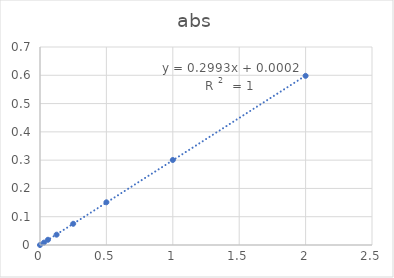
| Category | abs |
|---|---|
| 0.0 | 0 |
| 0.03 | 0.008 |
| 0.06 | 0.018 |
| 0.125 | 0.036 |
| 0.25 | 0.075 |
| 0.5 | 0.151 |
| 1.0 | 0.3 |
| 2.0 | 0.598 |